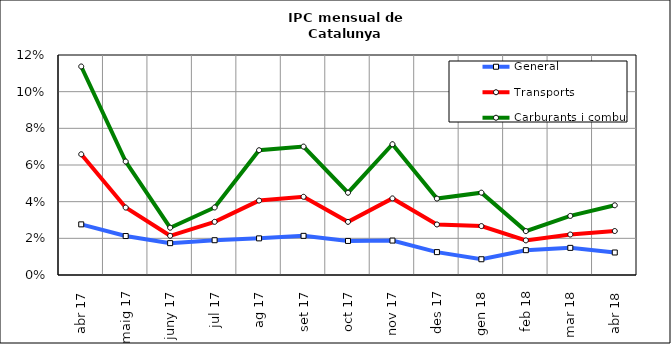
| Category | General | Transports | Carburants i combustibles |
|---|---|---|---|
| abr 17 | 0.028 | 0.066 | 0.114 |
| maig 17 | 0.021 | 0.037 | 0.062 |
| juny 17 | 0.017 | 0.021 | 0.026 |
| jul 17 | 0.019 | 0.029 | 0.037 |
| ag 17 | 0.02 | 0.041 | 0.068 |
| set 17 | 0.021 | 0.043 | 0.07 |
| oct 17 | 0.019 | 0.029 | 0.045 |
| nov 17 | 0.019 | 0.042 | 0.071 |
| des 17 | 0.012 | 0.028 | 0.042 |
| gen 18 | 0.009 | 0.027 | 0.045 |
| feb 18 | 0.014 | 0.019 | 0.024 |
| mar 18 | 0.015 | 0.022 | 0.032 |
| abr 18 | 0.012 | 0.024 | 0.038 |